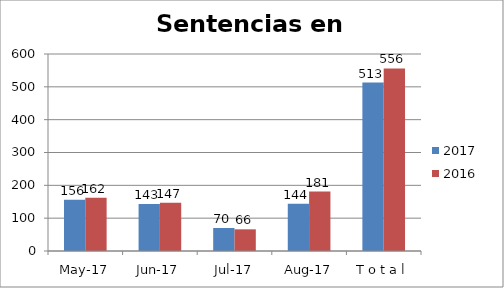
| Category | 2017 | 2016 |
|---|---|---|
| may-17 | 156 | 162 |
| jun-17 | 143 | 147 |
| jul-17 | 70 | 66 |
| ago-17 | 144 | 181 |
| T o t a l | 513 | 556 |